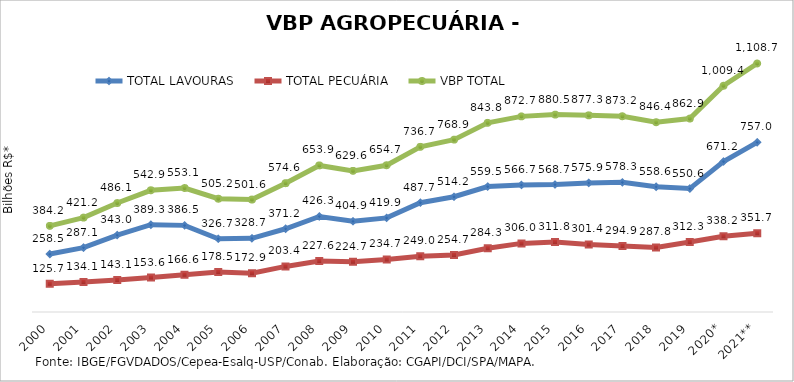
| Category | TOTAL LAVOURAS | TOTAL PECUÁRIA | VBP TOTAL |
|---|---|---|---|
| 2000 | 258.504 | 125.656 | 384.16 |
| 2001 | 287.15 | 134.059 | 421.209 |
| 2002 | 343.01 | 143.109 | 486.119 |
| 2003 | 389.314 | 153.602 | 542.916 |
| 2004 | 386.464 | 166.615 | 553.078 |
| 2005 | 326.738 | 178.485 | 505.222 |
| 2006 | 328.734 | 172.865 | 501.598 |
| 2007 | 371.245 | 203.366 | 574.61 |
| 2008 | 426.281 | 227.615 | 653.895 |
| 2009 | 404.91 | 224.654 | 629.564 |
| 2010 | 419.936 | 234.72 | 654.657 |
| 2011 | 487.704 | 248.978 | 736.682 |
| 2012 | 514.225 | 254.689 | 768.915 |
| 2013 | 559.48 | 284.33 | 843.81 |
| 2014 | 566.678 | 306.02 | 872.699 |
| 2015 | 568.735 | 311.751 | 880.486 |
| 2016 | 575.926 | 301.385 | 877.312 |
| 2017 | 578.318 | 294.909 | 873.227 |
| 2018 | 558.622 | 287.777 | 846.399 |
| 2019 | 550.589 | 312.321 | 862.91 |
| 2020* | 671.181 | 338.243 | 1009.424 |
| 2021** | 756.96 | 351.723 | 1108.682 |